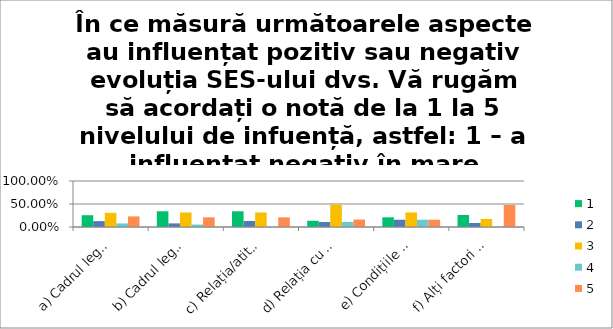
| Category | 1 | 2 | 3 | 4 | 5 |
|---|---|---|---|---|---|
| a) Cadrul legal și politicile publice/programele de sprijin pentru întreprinderi IMM în general | 0.256 | 0.128 | 0.308 | 0.077 | 0.231 |
| b) Cadrul legal pentru economia socială în special | 0.342 | 0.079 | 0.316 | 0.053 | 0.21 |
| c) Relația/atitudinea/ preocuparea autorităților publice locale față de sectorul economiei sociale | 0.342 | 0.132 | 0.316 | 0 | 0.21 |
| d) Relația cu alte întreprinderi de economie socială, participarea în rețele, uniuni, federații de economie socială | 0.135 | 0.108 | 0.486 | 0.108 | 0.162 |
| e) Condițiile specifice de piață pentru bunurile și/sau serviciile oferite de către SES-ul dvs | 0.21 | 0.158 | 0.316 | 0.158 | 0.158 |
| f) Alți factori care au influențat/au avut un impact semnificativ. Vă rugăm să indicați care sunt aceștia. | 0.261 | 0.087 | 0.174 | 0 | 0.478 |